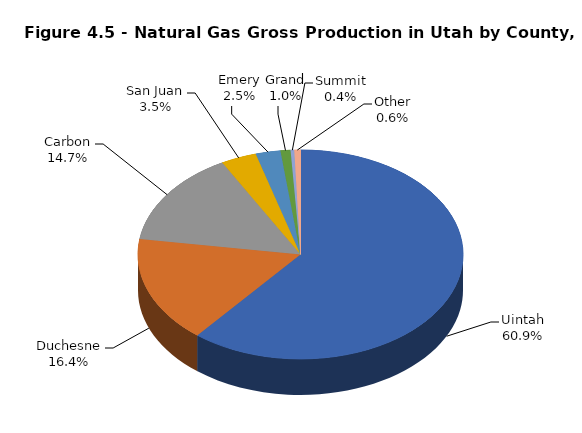
| Category | Series 0 |
|---|---|
| Uintah | 147343176 |
| Duchesne | 39742360 |
| Carbon | 35446094 |
| San Juan | 8579801 |
| Emery | 5970490 |
| Grand | 2400019 |
| Summit | 868890 |
| Other | 1494852 |